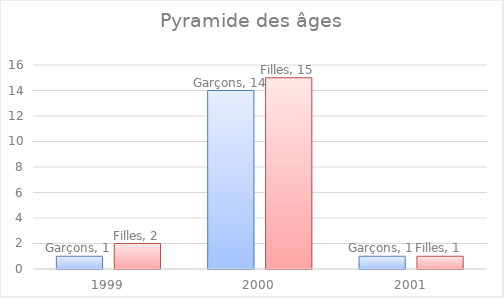
| Category | Garçons | Filles |
|---|---|---|
| 1999.0 | 1 | 2 |
| 2000.0 | 14 | 15 |
| 2001.0 | 1 | 1 |